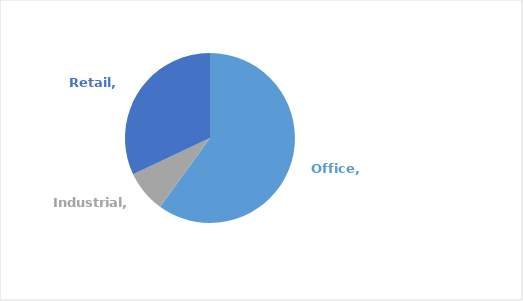
| Category | Series 0 |
|---|---|
| Office | 0.6 |
| Industrial | 0.08 |
| Retail | 0.32 |